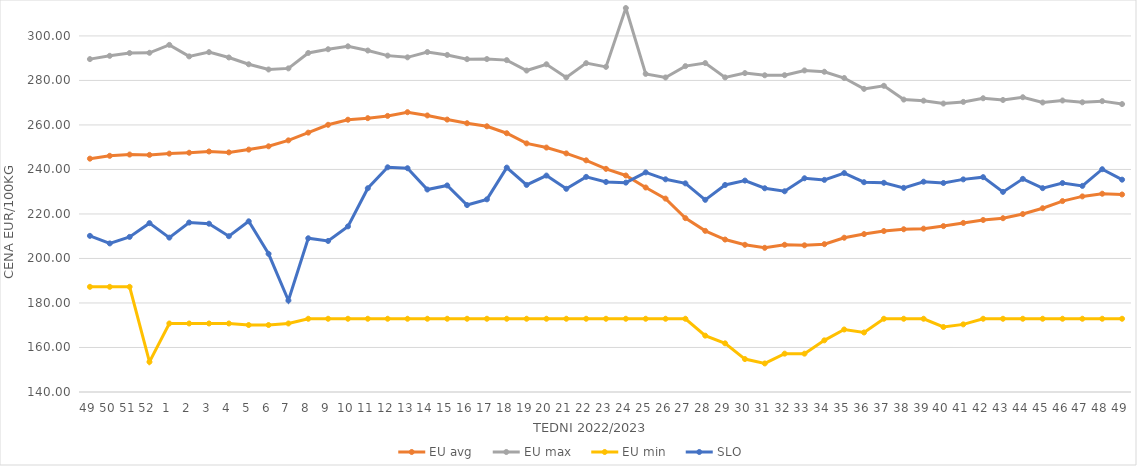
| Category | EU avg | EU max | EU min | SLO |
|---|---|---|---|---|
| 49.0 | 244.854 | 289.585 | 187.26 | 210.16 |
| 50.0 | 246.132 | 291.057 | 187.26 | 206.76 |
| 51.0 | 246.705 | 292.307 | 187.26 | 209.69 |
| 52.0 | 246.546 | 292.426 | 153.54 | 215.87 |
| 1.0 | 247.118 | 295.98 | 170.79 | 209.37 |
| 2.0 | 247.516 | 290.8 | 170.79 | 216.15 |
| 3.0 | 248.079 | 292.71 | 170.79 | 215.63 |
| 4.0 | 247.672 | 290.32 | 170.79 | 210 |
| 5.0 | 248.924 | 287.27 | 170.09 | 216.7 |
| 6.0 | 250.4 | 284.92 | 170.09 | 202.1 |
| 7.0 | 253.074 | 285.42 | 170.79 | 181.11 |
| 8.0 | 256.543 | 292.35 | 172.91 | 209.08 |
| 9.0 | 260.066 | 294.02 | 172.91 | 207.87 |
| 10.0 | 262.352 | 295.33 | 172.91 | 214.42 |
| 11.0 | 263.049 | 293.44 | 172.91 | 231.56 |
| 12.0 | 264.068 | 291.15 | 172.91 | 240.97 |
| 13.0 | 265.73 | 290.38 | 172.91 | 240.55 |
| 14.0 | 264.262 | 292.763 | 172.91 | 230.99 |
| 15.0 | 262.411 | 291.46 | 172.91 | 232.82 |
| 16.0 | 260.77 | 289.56 | 172.91 | 224 |
| 17.0 | 259.395 | 289.61 | 172.91 | 226.57 |
| 18.0 | 256.275 | 289.13 | 172.91 | 240.83 |
| 19.0 | 251.716 | 284.45 | 172.91 | 233.05 |
| 20.0 | 249.836 | 287.26 | 172.91 | 237.25 |
| 21.0 | 247.212 | 281.33 | 172.91 | 231.3 |
| 22.0 | 244.103 | 287.77 | 172.91 | 236.67 |
| 23.0 | 240.279 | 286.1 | 172.91 | 234.39 |
| 24.0 | 237.289 | 312.54 | 172.91 | 234.08 |
| 25.0 | 231.895 | 282.95 | 172.91 | 238.69 |
| 26.0 | 226.903 | 281.34 | 172.91 | 235.57 |
| 27.0 | 218.126 | 286.43 | 172.91 | 233.75 |
| 28.0 | 212.406 | 287.8 | 165.32 | 226.35 |
| 29.0 | 208.504 | 281.37 | 161.87 | 233.03 |
| 30.0 | 206.149 | 283.3 | 154.8 | 235 |
| 31.0 | 204.79 | 282.32 | 152.83 | 231.55 |
| 32.0 | 206.16 | 282.36 | 157.23 | 230.2 |
| 33.0 | 205.917 | 284.5 | 157.23 | 236.04 |
| 34.0 | 206.436 | 283.9 | 163.21 | 235.32 |
| 35.0 | 209.326 | 281.09 | 168.085 | 238.39 |
| 36.0 | 210.957 | 276.21 | 166.745 | 234.27 |
| 37.0 | 212.325 | 277.59 | 172.91 | 234 |
| 38.0 | 213.132 | 271.4 | 172.91 | 231.74 |
| 39.0 | 213.398 | 270.91 | 172.91 | 234.5 |
| 40.0 | 214.548 | 269.62 | 169.209 | 233.92 |
| 41.0 | 215.966 | 270.36 | 170.387 | 235.54 |
| 42.0 | 217.294 | 271.99 | 172.91 | 236.54 |
| 43.0 | 218.091 | 271.22 | 172.91 | 229.92 |
| 44.0 | 219.965 | 272.45 | 172.91 | 235.77 |
| 45.0 | 222.584 | 270.09 | 172.91 | 231.6 |
| 46.0 | 225.795 | 270.99 | 172.91 | 233.89 |
| 47.0 | 227.893 | 270.18 | 172.91 | 232.62 |
| 48.0 | 229.095 | 270.7 | 172.91 | 240.11 |
| 49.0 | 228.757 | 269.38 | 172.91 | 235.41 |